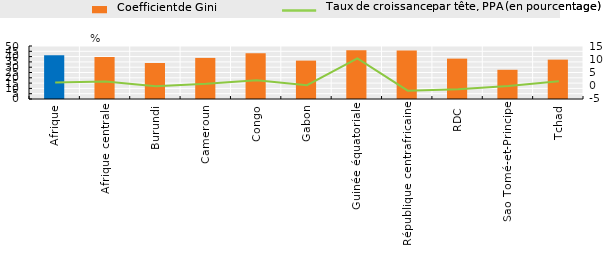
| Category | Coefficient de Gini |
|---|---|
| Afrique | 41.191 |
| Afrique centrale | 39.71 |
| Burundi | 33.97 |
| Cameroun | 38.764 |
| Congo | 43.087 |
| Gabon | 36.21 |
| Guinée équatoriale | 46.07 |
| République centrafricaine | 45.722 |
| RDC | 38.082 |
| Sao Tomé-et-Principe | 27.561 |
| Tchad | 37.138 |